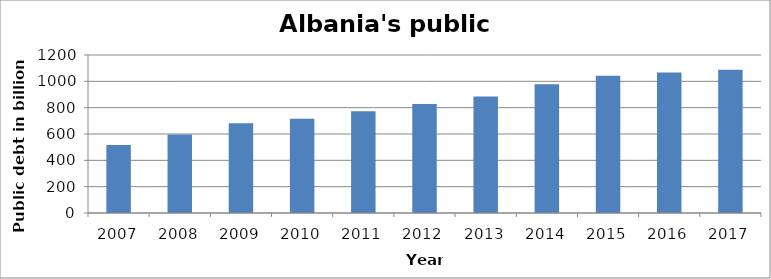
| Category | Public debt in billion ALL |
|---|---|
| 2007.0 | 517 |
| 2008.0 | 595.8 |
| 2009.0 | 682.5 |
| 2010.0 | 715.5 |
| 2011.0 | 772.7 |
| 2012.0 | 828.2 |
| 2013.0 | 885 |
| 2014.0 | 977.9 |
| 2015.0 | 1043.2 |
| 2016.0 | 1066.5 |
| 2017.0 | 1088 |